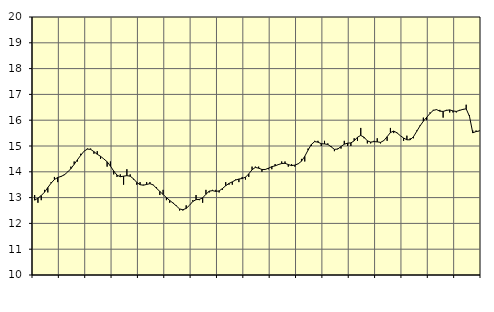
| Category | Piggar | Vård och omsorg, SNI 86-88 |
|---|---|---|
| nan | 13.1 | 12.9 |
| 87.0 | 12.8 | 12.98 |
| 87.0 | 12.9 | 13.08 |
| 87.0 | 13.3 | 13.21 |
| nan | 13.2 | 13.39 |
| 88.0 | 13.6 | 13.56 |
| 88.0 | 13.8 | 13.7 |
| 88.0 | 13.6 | 13.78 |
| nan | 13.8 | 13.82 |
| 89.0 | 13.9 | 13.88 |
| 89.0 | 14 | 13.99 |
| 89.0 | 14.2 | 14.12 |
| nan | 14.4 | 14.29 |
| 90.0 | 14.4 | 14.47 |
| 90.0 | 14.7 | 14.64 |
| 90.0 | 14.8 | 14.8 |
| nan | 14.9 | 14.88 |
| 91.0 | 14.9 | 14.87 |
| 91.0 | 14.7 | 14.78 |
| 91.0 | 14.8 | 14.68 |
| nan | 14.5 | 14.6 |
| 92.0 | 14.5 | 14.5 |
| 92.0 | 14.2 | 14.39 |
| 92.0 | 14.4 | 14.22 |
| nan | 13.9 | 14.03 |
| 93.0 | 13.8 | 13.87 |
| 93.0 | 13.9 | 13.81 |
| 93.0 | 13.5 | 13.83 |
| nan | 14.1 | 13.85 |
| 94.0 | 13.9 | 13.83 |
| 94.0 | 13.7 | 13.73 |
| 94.0 | 13.5 | 13.59 |
| nan | 13.6 | 13.5 |
| 95.0 | 13.5 | 13.48 |
| 95.0 | 13.6 | 13.51 |
| 95.0 | 13.6 | 13.54 |
| nan | 13.5 | 13.49 |
| 96.0 | 13.4 | 13.36 |
| 96.0 | 13.1 | 13.24 |
| 96.0 | 13.3 | 13.12 |
| nan | 12.9 | 13 |
| 97.0 | 12.8 | 12.89 |
| 97.0 | 12.8 | 12.79 |
| 97.0 | 12.7 | 12.68 |
| nan | 12.5 | 12.56 |
| 98.0 | 12.5 | 12.53 |
| 98.0 | 12.7 | 12.58 |
| 98.0 | 12.7 | 12.7 |
| nan | 12.9 | 12.85 |
| 99.0 | 13.1 | 12.92 |
| 99.0 | 12.9 | 12.93 |
| 99.0 | 12.8 | 12.99 |
| nan | 13.3 | 13.13 |
| 0.0 | 13.2 | 13.25 |
| 0.0 | 13.3 | 13.27 |
| 0.0 | 13.3 | 13.24 |
| nan | 13.2 | 13.26 |
| 1.0 | 13.3 | 13.35 |
| 1.0 | 13.6 | 13.46 |
| 1.0 | 13.5 | 13.55 |
| nan | 13.5 | 13.61 |
| 2.0 | 13.7 | 13.68 |
| 2.0 | 13.6 | 13.72 |
| 2.0 | 13.8 | 13.74 |
| nan | 13.7 | 13.79 |
| 3.0 | 13.8 | 13.92 |
| 3.0 | 14.2 | 14.08 |
| 3.0 | 14.2 | 14.17 |
| nan | 14.2 | 14.14 |
| 4.0 | 14 | 14.09 |
| 4.0 | 14.1 | 14.09 |
| 4.0 | 14.1 | 14.14 |
| nan | 14.1 | 14.2 |
| 5.0 | 14.3 | 14.23 |
| 5.0 | 14.3 | 14.28 |
| 5.0 | 14.4 | 14.32 |
| nan | 14.4 | 14.33 |
| 6.0 | 14.2 | 14.28 |
| 6.0 | 14.3 | 14.24 |
| 6.0 | 14.2 | 14.26 |
| nan | 14.3 | 14.31 |
| 7.0 | 14.5 | 14.41 |
| 7.0 | 14.4 | 14.6 |
| 7.0 | 14.9 | 14.84 |
| nan | 15 | 15.06 |
| 8.0 | 15.2 | 15.17 |
| 8.0 | 15.2 | 15.15 |
| 8.0 | 15 | 15.09 |
| nan | 15.2 | 15.08 |
| 9.0 | 15.1 | 15.06 |
| 9.0 | 15 | 14.97 |
| 9.0 | 14.8 | 14.87 |
| nan | 14.9 | 14.88 |
| 10.0 | 14.9 | 14.98 |
| 10.0 | 15.2 | 15.07 |
| 10.0 | 15 | 15.11 |
| nan | 15 | 15.12 |
| 11.0 | 15.3 | 15.2 |
| 11.0 | 15.2 | 15.34 |
| 11.0 | 15.7 | 15.41 |
| nan | 15.3 | 15.34 |
| 12.0 | 15.1 | 15.2 |
| 12.0 | 15.1 | 15.15 |
| 12.0 | 15.2 | 15.17 |
| nan | 15.3 | 15.16 |
| 13.0 | 15.1 | 15.14 |
| 13.0 | 15.2 | 15.21 |
| 13.0 | 15.2 | 15.36 |
| nan | 15.7 | 15.52 |
| 14.0 | 15.5 | 15.58 |
| 14.0 | 15.5 | 15.51 |
| 14.0 | 15.4 | 15.4 |
| nan | 15.2 | 15.31 |
| 15.0 | 15.4 | 15.24 |
| 15.0 | 15.3 | 15.24 |
| 15.0 | 15.3 | 15.36 |
| nan | 15.6 | 15.57 |
| 16.0 | 15.8 | 15.78 |
| 16.0 | 16.1 | 15.96 |
| 16.0 | 16 | 16.11 |
| nan | 16.3 | 16.26 |
| 17.0 | 16.4 | 16.38 |
| 17.0 | 16.4 | 16.41 |
| 17.0 | 16.4 | 16.35 |
| nan | 16.1 | 16.34 |
| 18.0 | 16.4 | 16.38 |
| 18.0 | 16.3 | 16.4 |
| 18.0 | 16.3 | 16.36 |
| nan | 16.3 | 16.34 |
| 19.0 | 16.4 | 16.38 |
| 19.0 | 16.4 | 16.42 |
| 19.0 | 16.6 | 16.44 |
| nan | 16.2 | 16.15 |
| 20.0 | 15.6 | 15.51 |
| 20.0 | 15.6 | 15.56 |
| 20.0 | 15.6 | 15.58 |